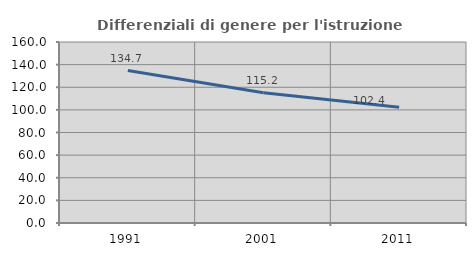
| Category | Differenziali di genere per l'istruzione superiore |
|---|---|
| 1991.0 | 134.716 |
| 2001.0 | 115.213 |
| 2011.0 | 102.42 |